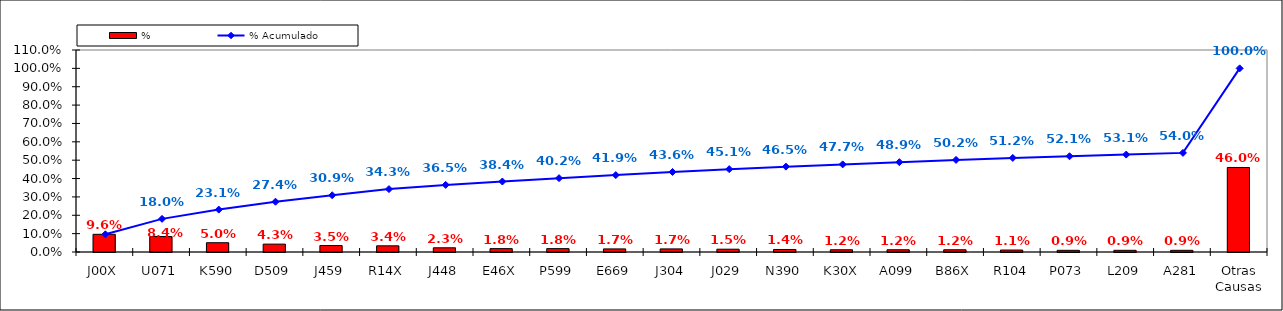
| Category | % |
|---|---|
| J00X | 0.096 |
| U071 | 0.084 |
| K590 | 0.05 |
| D509 | 0.043 |
| J459 | 0.035 |
| R14X | 0.034 |
| J448 | 0.023 |
| E46X | 0.018 |
| P599 | 0.018 |
| E669 | 0.017 |
| J304 | 0.017 |
| J029 | 0.015 |
| N390 | 0.014 |
| K30X | 0.012 |
| A099 | 0.012 |
| B86X | 0.012 |
| R104 | 0.011 |
| P073 | 0.009 |
| L209 | 0.009 |
| A281 | 0.009 |
| Otras Causas | 0.46 |